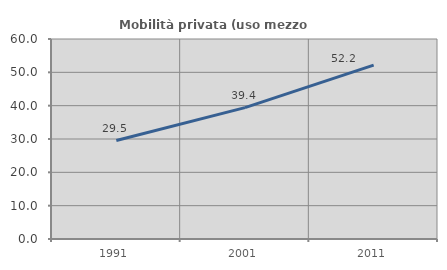
| Category | Mobilità privata (uso mezzo privato) |
|---|---|
| 1991.0 | 29.543 |
| 2001.0 | 39.403 |
| 2011.0 | 52.18 |